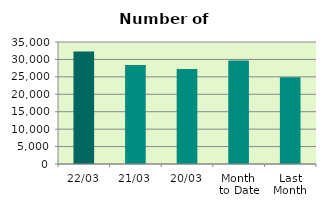
| Category | Series 0 |
|---|---|
| 22/03 | 32302 |
| 21/03 | 28376 |
| 20/03 | 27252 |
| Month 
to Date | 29669.125 |
| Last
Month | 24872.2 |